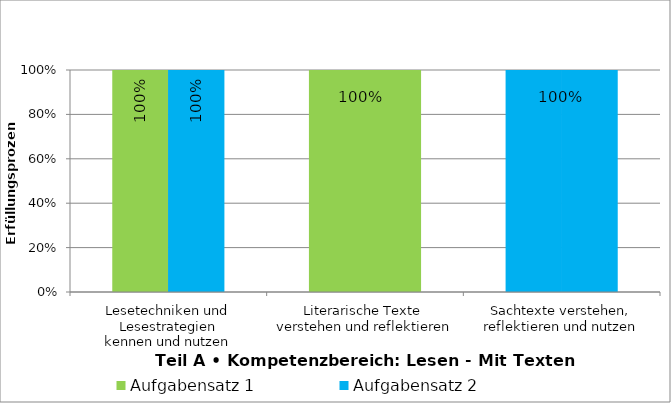
| Category | Aufgabensatz 1 | Aufgabensatz 2 |
|---|---|---|
| Lesetechniken und Lesestrategien
kennen und nutzen | 1 | 1 |
| Literarische Texte 
verstehen und reflektieren | 1 | 1 |
| Sachtexte verstehen,
reflektieren und nutzen | 1 | 1 |